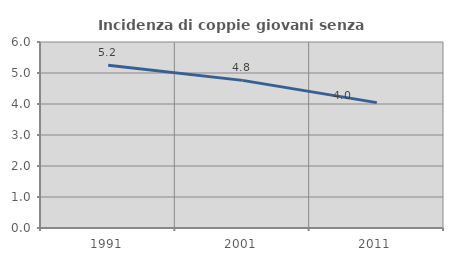
| Category | Incidenza di coppie giovani senza figli |
|---|---|
| 1991.0 | 5.248 |
| 2001.0 | 4.762 |
| 2011.0 | 4.044 |